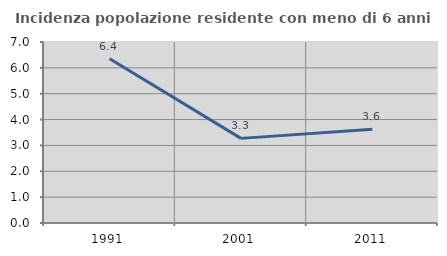
| Category | Incidenza popolazione residente con meno di 6 anni |
|---|---|
| 1991.0 | 6.352 |
| 2001.0 | 3.273 |
| 2011.0 | 3.63 |